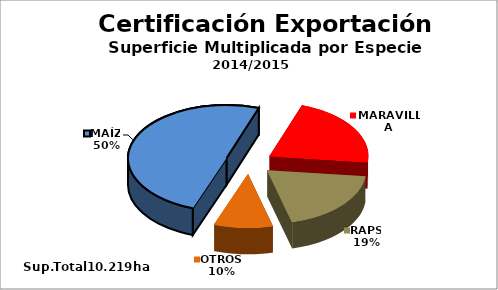
| Category | Series 0 |
|---|---|
| MAÍZ | 5084.7 |
| MARAVILLA | 2198 |
| RAPS | 1955 |
| OTROS | 981 |